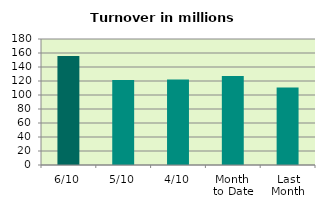
| Category | Series 0 |
|---|---|
| 6/10 | 155.851 |
| 5/10 | 121.376 |
| 4/10 | 122.193 |
| Month 
to Date | 127.102 |
| Last
Month | 110.611 |